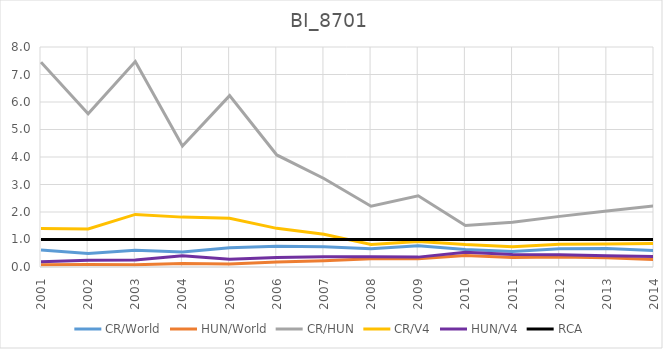
| Category | CR/World | HUN/World | CR/HUN | CR/V4 | HUN/V4 | RCA |
|---|---|---|---|---|---|---|
| 2001.0 | 0.615 | 0.083 | 7.448 | 1.396 | 0.187 | 1 |
| 2002.0 | 0.494 | 0.089 | 5.575 | 1.381 | 0.248 | 1 |
| 2003.0 | 0.606 | 0.081 | 7.472 | 1.913 | 0.256 | 1 |
| 2004.0 | 0.545 | 0.124 | 4.403 | 1.814 | 0.412 | 1 |
| 2005.0 | 0.697 | 0.112 | 6.231 | 1.773 | 0.285 | 1 |
| 2006.0 | 0.755 | 0.185 | 4.075 | 1.405 | 0.345 | 1 |
| 2007.0 | 0.735 | 0.228 | 3.218 | 1.192 | 0.37 | 1 |
| 2008.0 | 0.667 | 0.302 | 2.211 | 0.82 | 0.371 | 1 |
| 2009.0 | 0.771 | 0.298 | 2.59 | 0.93 | 0.359 | 1 |
| 2010.0 | 0.635 | 0.42 | 1.513 | 0.814 | 0.538 | 1 |
| 2011.0 | 0.562 | 0.346 | 1.626 | 0.739 | 0.455 | 1 |
| 2012.0 | 0.666 | 0.362 | 1.841 | 0.827 | 0.45 | 1 |
| 2013.0 | 0.676 | 0.332 | 2.037 | 0.838 | 0.411 | 1 |
| 2014.0 | 0.596 | 0.268 | 2.226 | 0.853 | 0.383 | 1 |